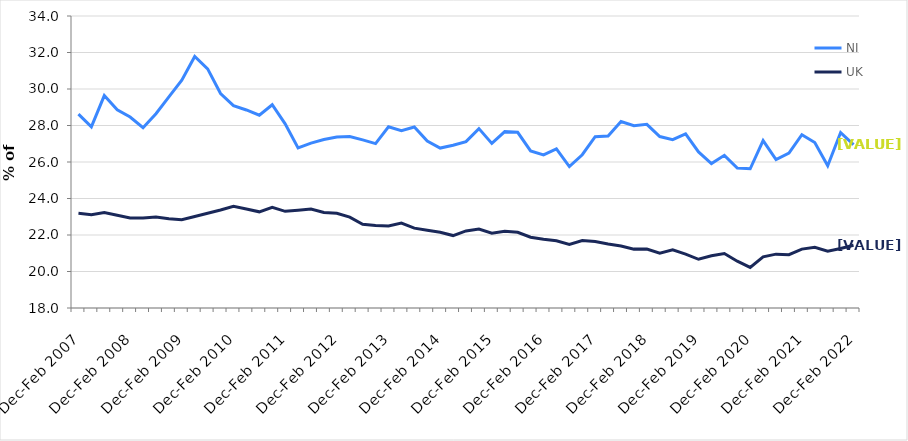
| Category | NI | UK |
|---|---|---|
| Dec-Feb 2007 | 28.62 | 23.193 |
| Mar-May 2007 | 27.923 | 23.117 |
| Jun-Aug 2007 | 29.639 | 23.233 |
| Sep-Nov 2007 | 28.863 | 23.08 |
| Dec-Feb 2008 | 28.464 | 22.927 |
| Mar-May 2008 | 27.876 | 22.927 |
| Jun-Aug 2008 | 28.643 | 22.988 |
| Sep-Nov 2008 | 29.57 | 22.895 |
| Dec-Feb 2009 | 30.485 | 22.838 |
| Mar-May 2009 | 31.781 | 23.012 |
| Jun-Aug 2009 | 31.102 | 23.19 |
| Sep-Nov 2009 | 29.75 | 23.371 |
| Dec-Feb 2010 | 29.087 | 23.57 |
| Mar-May 2010 | 28.851 | 23.429 |
| Jun-Aug 2010 | 28.566 | 23.27 |
| Sep-Nov 2010 | 29.138 | 23.518 |
| Dec-Feb 2011 | 28.094 | 23.297 |
| Mar-May 2011 | 26.772 | 23.362 |
| Jun-Aug 2011 | 27.037 | 23.423 |
| Sep-Nov 2011 | 27.228 | 23.236 |
| Dec-Feb 2012 | 27.371 | 23.194 |
| Mar-May 2012 | 27.398 | 22.98 |
| Jun-Aug 2012 | 27.21 | 22.589 |
| Sep-Nov 2012 | 27.009 | 22.519 |
| Dec-Feb 2013 | 27.931 | 22.499 |
| Mar-May 2013 | 27.714 | 22.65 |
| Jun-Aug 2013 | 27.917 | 22.378 |
| Sep-Nov 2013 | 27.144 | 22.258 |
| Dec-Feb 2014 | 26.764 | 22.147 |
| Mar-May 2014 | 26.916 | 21.969 |
| Jun-Aug 2014 | 27.117 | 22.224 |
| Sep-Nov 2014 | 27.83 | 22.331 |
| Dec-Feb 2015 | 27.019 | 22.102 |
| Mar-May 2015 | 27.663 | 22.208 |
| Jun-Aug 2015 | 27.627 | 22.147 |
| Sep-Nov 2015 | 26.607 | 21.876 |
| Dec-Feb 2016 | 26.39 | 21.762 |
| Mar-May 2016 | 26.717 | 21.68 |
| Jun-Aug 2016 | 25.75 | 21.489 |
| Sep-Nov 2016 | 26.398 | 21.696 |
| Dec-Feb 2017 | 27.386 | 21.639 |
| Mar-May 2017 | 27.429 | 21.505 |
| Jun-Aug 2017 | 28.219 | 21.393 |
| Sep-Nov 2017 | 27.989 | 21.226 |
| Dec-Feb 2018 | 28.064 | 21.23 |
| Mar-May 2018 | 27.395 | 21.007 |
| Jun-Aug 2018 | 27.227 | 21.183 |
| Sep-Nov 2018 | 27.537 | 20.956 |
| Dec-Feb 2019 | 26.552 | 20.67 |
| Mar-May 2019 | 25.916 | 20.862 |
| Jun-Aug 2019 | 26.366 | 20.988 |
| Sep-Nov 2019 | 25.673 | 20.563 |
| Dec-Feb 2020 | 25.628 | 20.223 |
| Mar-May 2020 | 27.172 | 20.801 |
| Jun-Aug 2020 | 26.132 | 20.951 |
| Sep-Nov 2020 | 26.483 | 20.924 |
| Dec-Feb 2021 | 27.496 | 21.228 |
| Mar-May 2021 | 27.071 | 21.326 |
| Jun-Aug 2021 | 25.797 | 21.11 |
| Sep-Nov 2021 | 27.614 | 21.265 |
| Dec-Feb 2022 | 26.956 | 21.442 |